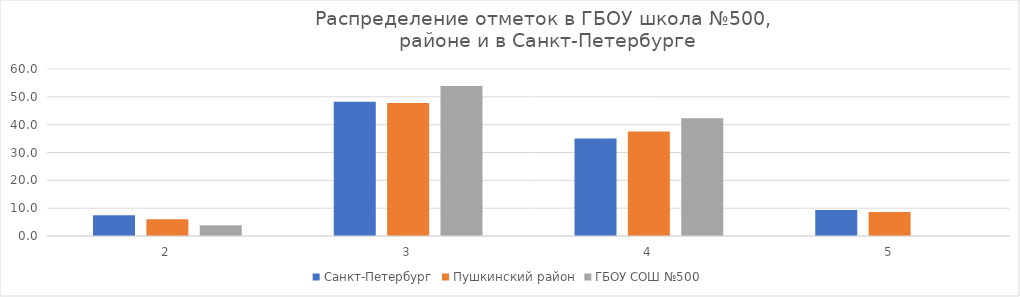
| Category | Санкт-Петербург | Пушкинский район | ГБОУ СОШ №500 |
|---|---|---|---|
| 2.0 | 7.42 | 6.03 | 3.85 |
| 3.0 | 48.19 | 47.81 | 53.85 |
| 4.0 | 35.07 | 37.53 | 42.31 |
| 5.0 | 9.32 | 8.63 | 0 |